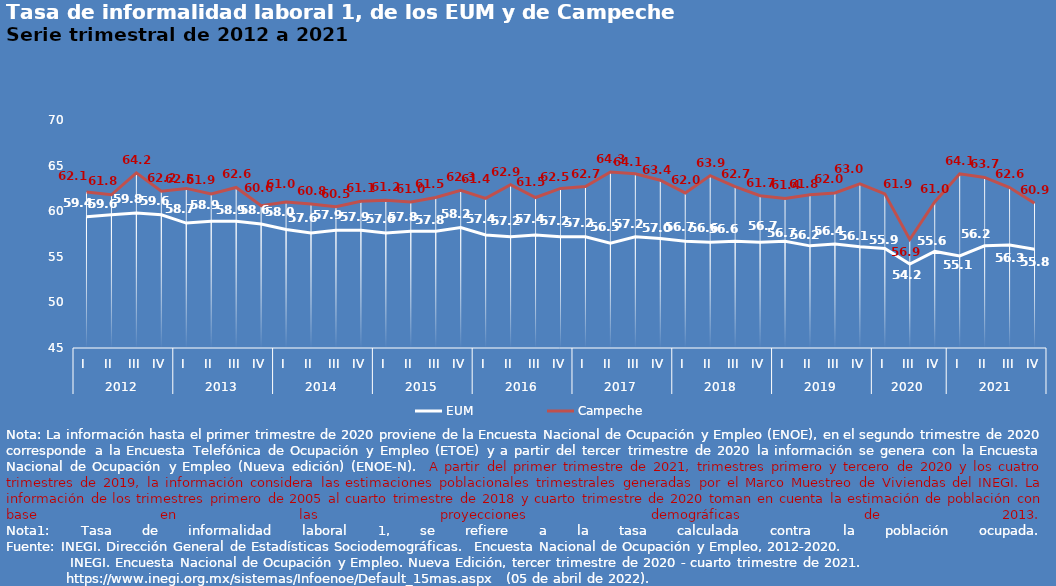
| Category | EUM | Campeche |
|---|---|---|
| 0 | 59.4 | 62.1 |
| 1 | 59.6 | 61.8 |
| 2 | 59.8 | 64.2 |
| 3 | 59.6 | 62.2 |
| 4 | 58.7 | 62.5 |
| 5 | 58.9 | 61.9 |
| 6 | 58.9 | 62.6 |
| 7 | 58.6 | 60.6 |
| 8 | 58 | 61 |
| 9 | 57.6 | 60.8 |
| 10 | 57.9 | 60.5 |
| 11 | 57.9 | 61.1 |
| 12 | 57.6 | 61.2 |
| 13 | 57.8 | 61 |
| 14 | 57.8 | 61.5 |
| 15 | 58.2 | 62.3 |
| 16 | 57.4 | 61.4 |
| 17 | 57.2 | 62.9 |
| 18 | 57.4 | 61.5 |
| 19 | 57.2 | 62.5 |
| 20 | 57.2 | 62.7 |
| 21 | 56.5 | 64.3 |
| 22 | 57.2 | 64.1 |
| 23 | 57 | 63.4 |
| 24 | 56.7 | 62 |
| 25 | 56.6 | 63.9 |
| 26 | 56.7 | 62.7 |
| 27 | 56.6 | 61.7 |
| 28 | 56.7 | 61.4 |
| 29 | 56.2 | 61.8 |
| 30 | 56.4 | 62 |
| 31 | 56.1 | 63 |
| 32 | 55.9 | 61.9 |
| 33 | 54.2 | 56.9 |
| 34 | 55.588 | 61.018 |
| 35 | 55.1 | 64.1 |
| 36 | 56.2 | 63.7 |
| 37 | 56.3 | 62.6 |
| 38 | 55.836 | 60.874 |